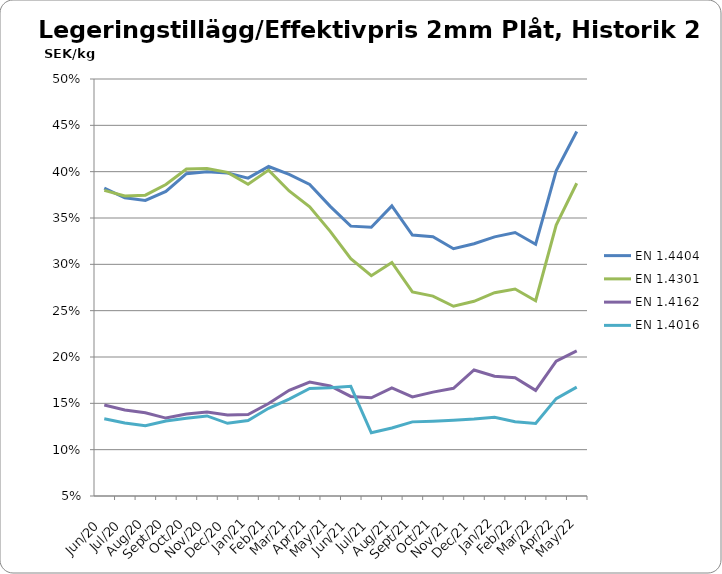
| Category | EN 1.4404 | EN 1.4301 | EN 1.4162  | EN 1.4016 |
|---|---|---|---|---|
| 2020-06-01 | 0.382 | 0.38 | 0.148 | 0.133 |
| 2020-07-01 | 0.372 | 0.374 | 0.143 | 0.129 |
| 2020-08-01 | 0.369 | 0.375 | 0.14 | 0.126 |
| 2020-09-01 | 0.379 | 0.386 | 0.134 | 0.131 |
| 2020-10-01 | 0.398 | 0.403 | 0.138 | 0.134 |
| 2020-11-01 | 0.4 | 0.403 | 0.141 | 0.136 |
| 2020-12-01 | 0.399 | 0.399 | 0.137 | 0.128 |
| 2021-01-01 | 0.393 | 0.386 | 0.138 | 0.131 |
| 2021-02-01 | 0.406 | 0.402 | 0.15 | 0.145 |
| 2021-03-01 | 0.397 | 0.379 | 0.164 | 0.155 |
| 2021-04-01 | 0.386 | 0.362 | 0.173 | 0.166 |
| 2021-05-01 | 0.363 | 0.336 | 0.169 | 0.167 |
| 2021-06-01 | 0.341 | 0.306 | 0.157 | 0.168 |
| 2021-07-01 | 0.34 | 0.288 | 0.156 | 0.118 |
| 2021-08-01 | 0.363 | 0.302 | 0.167 | 0.123 |
| 2021-09-01 | 0.332 | 0.27 | 0.157 | 0.13 |
| 2021-10-01 | 0.33 | 0.266 | 0.162 | 0.131 |
| 2021-11-01 | 0.317 | 0.255 | 0.166 | 0.132 |
| 2021-12-01 | 0.322 | 0.26 | 0.186 | 0.133 |
| 2022-01-01 | 0.33 | 0.269 | 0.179 | 0.135 |
| 2022-02-01 | 0.334 | 0.273 | 0.178 | 0.13 |
| 2022-03-01 | 0.322 | 0.261 | 0.164 | 0.128 |
| 2022-04-01 | 0.401 | 0.342 | 0.196 | 0.155 |
| 2022-05-01 | 0.443 | 0.387 | 0.207 | 0.167 |